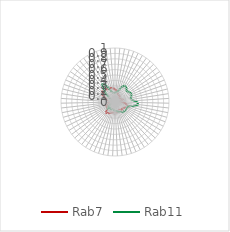
| Category | Rab7 | Rab11 |
|---|---|---|
| 0.0 | 0.23 | 0.171 |
| 0.10913 | 0.222 | 0.176 |
| 0.21825 | 0.2 | 0.188 |
| 0.32738 | 0.172 | 0.211 |
| 0.43651 | 0.156 | 0.259 |
| 0.54563 | 0.149 | 0.323 |
| 0.65476 | 0.146 | 0.347 |
| 0.76389 | 0.141 | 0.344 |
| 0.87302 | 0.137 | 0.33 |
| 0.98214 | 0.116 | 0.298 |
| 1.09127 | 0.126 | 0.305 |
| 1.2004 | 0.105 | 0.319 |
| 1.30952 | 0.11 | 0.337 |
| 1.41865 | 0.113 | 0.336 |
| 1.52778 | 0.141 | 0.316 |
| 1.6369 | 0.138 | 0.298 |
| 1.74603 | 0.099 | 0.307 |
| 1.85516 | 0.097 | 0.354 |
| 1.96429 | 0.128 | 0.418 |
| 2.07341 | 0.181 | 0.429 |
| 2.18254 | 0.222 | 0.356 |
| 2.29167 | 0.235 | 0.279 |
| 2.40079 | 0.262 | 0.246 |
| 2.50992 | 0.228 | 0.236 |
| 2.61905 | 0.2 | 0.242 |
| 2.72817 | 0.189 | 0.251 |
| 2.8373 | 0.194 | 0.254 |
| 2.94643 | 0.178 | 0.235 |
| 3.05556 | 0.185 | 0.242 |
| 3.16468 | 0.205 | 0.22 |
| 3.27381 | 0.164 | 0.211 |
| 3.38294 | 0.169 | 0.204 |
| 3.49206 | 0.194 | 0.194 |
| 3.60119 | 0.201 | 0.17 |
| 3.71032 | 0.196 | 0.154 |
| 3.81944 | 0.211 | 0.17 |
| 3.92857 | 0.217 | 0.157 |
| 4.0377 | 0.199 | 0.152 |
| 4.14683 | 0.206 | 0.135 |
| 4.25595 | 0.197 | 0.138 |
| 4.36508 | 0.215 | 0.141 |
| 4.47421 | 0.236 | 0.161 |
| 4.58333 | 0.239 | 0.155 |
| 4.69246 | 0.257 | 0.136 |
| 4.80159 | 0.238 | 0.157 |
| 4.91071 | 0.199 | 0.182 |
| 5.01984 | 0.186 | 0.172 |
| 5.12897 | 0.164 | 0.139 |
| 5.2381 | 0.158 | 0.093 |
| 5.34722 | 0.176 | 0.063 |
| 5.45635 | 0.158 | 0.061 |
| 5.56548 | 0.135 | 0.051 |
| 5.6746 | 0.098 | 0.05 |
| 5.78373 | 0.126 | 0.053 |
| 5.89286 | 0.108 | 0.062 |
| 6.00198 | 0.143 | 0.068 |
| 6.11111 | 0.148 | 0.066 |
| 6.22024 | 0.169 | 0.065 |
| 6.32937 | 0.218 | 0.074 |
| 6.43849 | 0.262 | 0.08 |
| 6.54762 | 0.267 | 0.11 |
| 6.65675 | 0.303 | 0.16 |
| 6.76587 | 0.284 | 0.245 |
| 6.875 | 0.315 | 0.336 |
| 6.98413 | 0.286 | 0.402 |
| 7.09325 | 0.273 | 0.383 |
| 7.20238 | 0.267 | 0.296 |
| 7.31151 | 0.271 | 0.219 |
| 7.42063 | 0.269 | 0.185 |
| 7.52976 | 0.259 | 0.168 |
| 7.63889 | 0.253 | 0.171 |